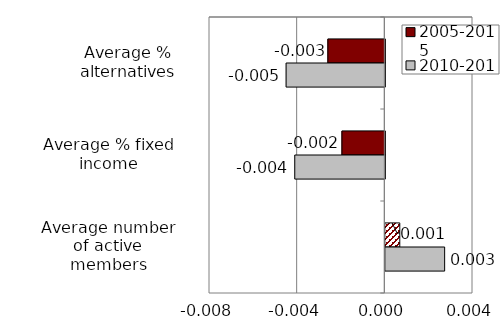
| Category | 2005-2015 | 2010-2015 |
|---|---|---|
| Average % alternatives | -0.003 | -0.005 |
| Average % fixed income | -0.002 | -0.004 |
| Average number of active members | 0.001 | 0.003 |